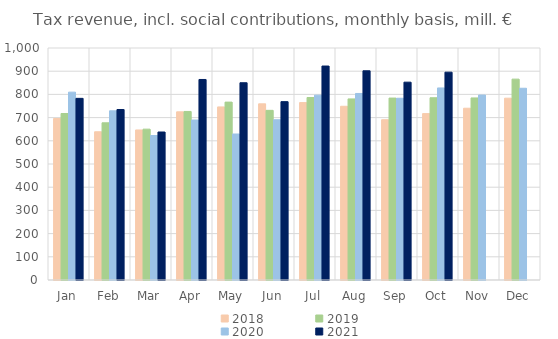
| Category | 2018 | 2019 | 2020 | 2021 |
|---|---|---|---|---|
| Jan | 696349.595 | 717665.072 | 809688.721 | 782986.001 |
| Feb | 638892.929 | 677510.103 | 729172.133 | 734852.065 |
| Mar | 646751.612 | 650253.135 | 622803.58 | 637891.51 |
| Apr | 724765.627 | 726487.169 | 689512.187 | 864350.424 |
| May | 746072.121 | 766741.521 | 629295.897 | 850252.991 |
| Jun | 759254.725 | 731242 | 690672.482 | 768738.388 |
| Jul | 764729.861 | 786636.326 | 796698.852 | 922262.256 |
| Aug | 748828.644 | 780536.674 | 803951.557 | 901674.184 |
| Sep | 690852.332 | 784169.124 | 783355.666 | 852725.586 |
| Oct | 717180.733 | 785502.085 | 827797.907 | 895873.595 |
| Nov | 740371.875 | 784818.309 | 797101.461 | 0 |
| Dec | 783686.707 | 865773.712 | 826496.37 | 0 |